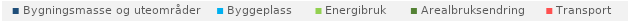
| Category | Bygningsmasse og uteområder | Byggeplass | Energibruk | Arealbruksendring | Transport |
|---|---|---|---|---|---|
| Hovedscenario | 0 | 0 | 0 | 0 | 0 |
| Scenario med tiltak | 0 | 0 | 0 | 0 | 0 |